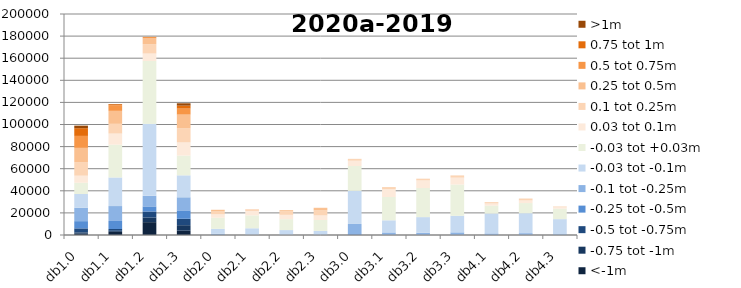
| Category | <-1m | -0.75 tot -1m | -0.5 tot -0.75m | -0.25 tot -0.5m | -0.1 tot -0.25m | -0.03 tot -0.1m | -0.03 tot +0.03m | 0.03 tot 0.1m | 0.1 tot 0.25m | 0.25 tot 0.5m | 0.5 tot 0.75m | 0.75 tot 1m | >1m |
|---|---|---|---|---|---|---|---|---|---|---|---|---|---|
| db1.0 | 1173 | 1182 | 3625 | 6555 | 12061 | 12505 | 10184 | 6409 | 12255 | 12909 | 10819 | 6982 | 2312 |
| db1.1 | 2901 | 908 | 1609 | 7280 | 13498 | 25861 | 29701 | 10044 | 8799 | 11752 | 5100 | 878 | 187 |
| db1.2 | 11626 | 4212 | 5411 | 4623 | 9590 | 65106 | 56899 | 6746 | 8436 | 5379 | 1114 | 129 | 17 |
| db1.3 | 3931 | 4948 | 5803 | 7604 | 11844 | 19869 | 17864 | 11926 | 12959 | 12214 | 5438 | 2669 | 2122 |
| db2.0 | 1 | 3 | 35 | 356 | 810 | 4373 | 10018 | 3169 | 2893 | 947 | 137 | 19 | 1 |
| db2.1 | 0 | 0 | 2 | 28 | 332 | 5730 | 11647 | 4044 | 1429 | 111 | 18 | 0 | 0 |
| db2.2 | 0 | 0 | 0 | 39 | 317 | 4098 | 9874 | 3927 | 3239 | 943 | 37 | 0 | 0 |
| db2.3 | 0 | 0 | 3 | 39 | 312 | 3330 | 9896 | 4167 | 4491 | 2170 | 142 | 1 | 0 |
| db3.0 | 2 | 7 | 35 | 658 | 9289 | 29952 | 22520 | 4764 | 1470 | 178 | 13 | 9 | 1 |
| db3.1 | 0 | 0 | 4 | 148 | 2173 | 10970 | 21073 | 7000 | 1924 | 131 | 2 | 0 | 0 |
| db3.2 | 4 | 3 | 12 | 135 | 1888 | 14137 | 26310 | 6933 | 1434 | 82 | 4 | 2 | 0 |
| db3.3 | 0 | 1 | 15 | 144 | 2237 | 15005 | 28292 | 6223 | 1837 | 151 | 14 | 1 | 0 |
| db4.1 | 0 | 0 | 3 | 78 | 1376 | 17997 | 7128 | 1968 | 1089 | 161 | 10 | 3 | 1 |
| db4.2 | 0 | 0 | 9 | 166 | 1498 | 18044 | 9169 | 2413 | 1352 | 247 | 16 | 2 | 2 |
| db4.3 | 0 | 1 | 4 | 133 | 623 | 13588 | 9516 | 1346 | 469 | 77 | 10 | 3 | 4 |